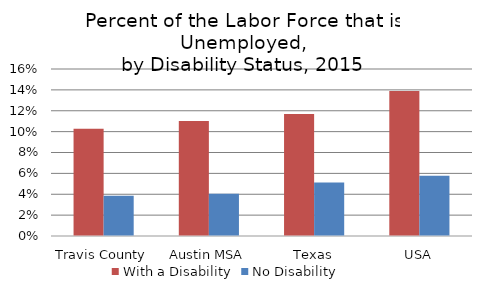
| Category | With a Disability | No Disability |
|---|---|---|
| Travis County | 0.103 | 0.039 |
| Austin MSA | 0.11 | 0.04 |
| Texas | 0.117 | 0.051 |
| USA | 0.139 | 0.058 |